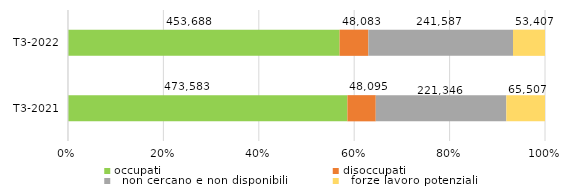
| Category | occupati | disoccupati |   non cercano e non disponibili |   forze lavoro potenziali |
|---|---|---|---|---|
|   T3-2021 | 473583 | 48095 | 221346 | 65507 |
|   T3-2022 | 453688 | 48083 | 241587 | 53407 |